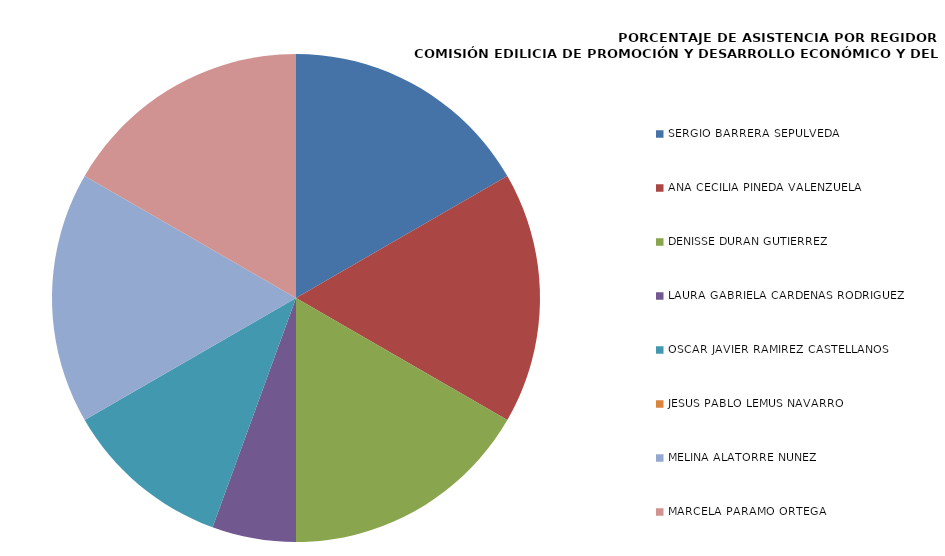
| Category | Series 0 |
|---|---|
| SERGIO BARRERA SEPÚLVEDA | 100 |
| ANA CECILIA PINEDA VALENZUELA | 100 |
| DENISSE DURÁN GUTIÉRREZ | 100 |
| LAURA GABRIELA CÁRDENAS RODRÍGUEZ | 33.333 |
| ÓSCAR JAVIER RAMÍREZ CASTELLANOS | 66.667 |
| JESÚS PABLO LEMUS NAVARRO | 0 |
| MELINA ALATORRE NÚÑEZ | 100 |
| MARCELA PÁRAMO ORTEGA | 100 |